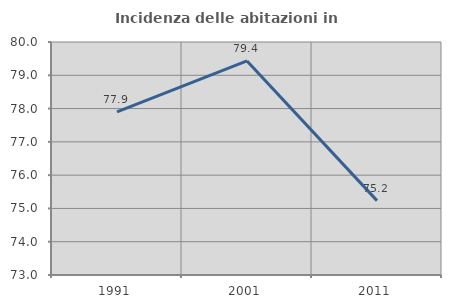
| Category | Incidenza delle abitazioni in proprietà  |
|---|---|
| 1991.0 | 77.899 |
| 2001.0 | 79.43 |
| 2011.0 | 75.235 |